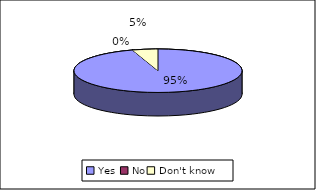
| Category | Did the nurse make you feel comfortable and at ease |
|---|---|
| Yes  | 58 |
| No | 0 |
| Don't know  | 3 |